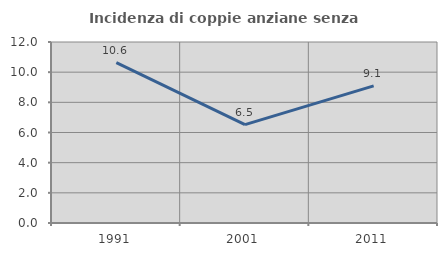
| Category | Incidenza di coppie anziane senza figli  |
|---|---|
| 1991.0 | 10.638 |
| 2001.0 | 6.522 |
| 2011.0 | 9.091 |